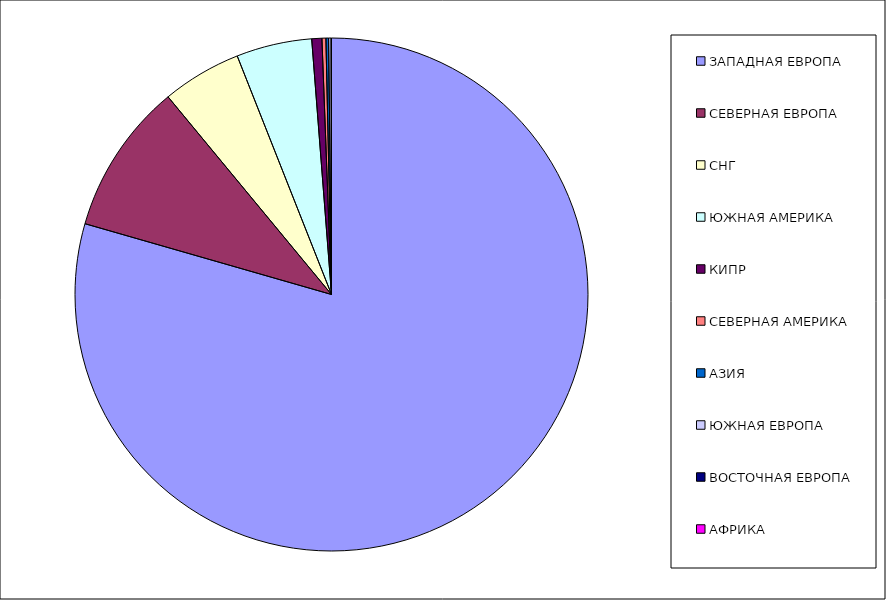
| Category | Оборот |
|---|---|
| ЗАПАДНАЯ ЕВРОПА | 0.794 |
| СЕВЕРНАЯ ЕВРОПА | 0.096 |
| СНГ | 0.05 |
| ЮЖНАЯ АМЕРИКА | 0.048 |
| КИПР | 0.006 |
| СЕВЕРНАЯ АМЕРИКА | 0.002 |
| АЗИЯ | 0.002 |
| ЮЖНАЯ ЕВРОПА | 0.002 |
| ВОСТОЧНАЯ ЕВРОПА | 0 |
| АФРИКА | 0 |